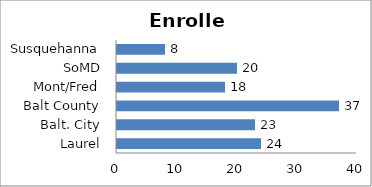
| Category | Enrolled |
|---|---|
| Laurel | 24 |
| Balt. City | 23 |
| Balt County | 37 |
| Mont/Fred | 18 |
| SoMD | 20 |
| Susquehanna | 8 |